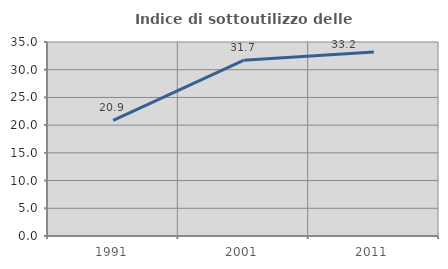
| Category | Indice di sottoutilizzo delle abitazioni  |
|---|---|
| 1991.0 | 20.862 |
| 2001.0 | 31.687 |
| 2011.0 | 33.2 |